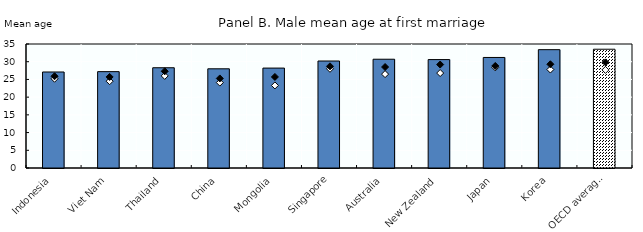
| Category | 2019 |
|---|---|
| Indonesia | 27.1 |
| Viet Nam | 27.2 |
| Thailand | 28.3 |
| China | 28 |
| Mongolia | 28.2 |
| Singapore | 30.2 |
| Australia | 30.7 |
| New Zealand | 30.6 |
| Japan | 31.2 |
| Korea | 33.4 |
| OECD average (e) | 33.527 |